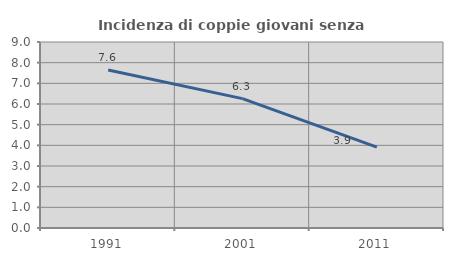
| Category | Incidenza di coppie giovani senza figli |
|---|---|
| 1991.0 | 7.649 |
| 2001.0 | 6.261 |
| 2011.0 | 3.915 |